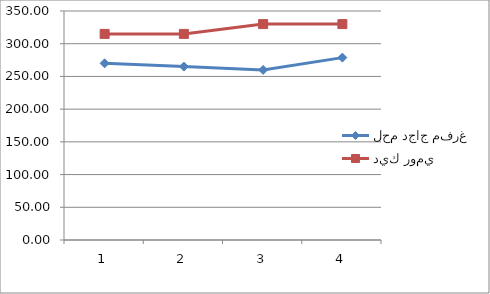
| Category | لحم دجاج مفرغ | ديك رومي |
|---|---|---|
| 0 | 270 | 315 |
| 1 | 265 | 315 |
| 2 | 260 | 330 |
| 3 | 278.75 | 330 |